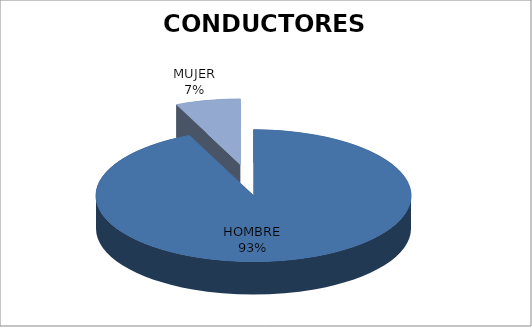
| Category | E.E. |
|---|---|
| HOMBRE | 28 |
| MUJER | 2 |